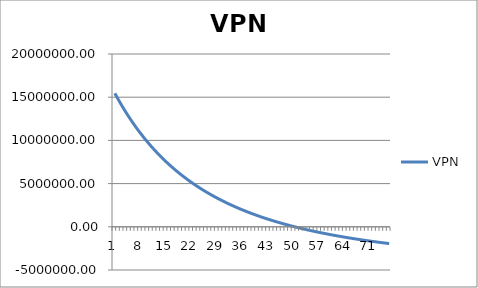
| Category | VPN |
|---|---|
| 0 | 15451750.503 |
| 1 | 14687321.208 |
| 2 | 13961316.212 |
| 3 | 13271384.889 |
| 4 | 12615343.767 |
| 5 | 11991163.071 |
| 6 | 11396954.472 |
| 7 | 10830959.926 |
| 8 | 10291541.487 |
| 9 | 9777172.008 |
| 10 | 9286426.642 |
| 11 | 8817975.075 |
| 12 | 8370574.407 |
| 13 | 7943062.636 |
| 14 | 7534352.68 |
| 15 | 7143426.894 |
| 16 | 6769332.028 |
| 17 | 6411174.603 |
| 18 | 6068116.648 |
| 19 | 5739371.781 |
| 20 | 5424201.596 |
| 21 | 5121912.337 |
| 22 | 4831851.82 |
| 23 | 4553406.603 |
| 24 | 4285999.363 |
| 25 | 4029086.474 |
| 26 | 3782155.767 |
| 27 | 3544724.455 |
| 28 | 3316337.214 |
| 29 | 3096564.397 |
| 30 | 2885000.386 |
| 31 | 2681262.058 |
| 32 | 2484987.361 |
| 33 | 2295833.989 |
| 34 | 2113478.155 |
| 35 | 1937613.446 |
| 36 | 1767949.758 |
| 37 | 1604212.299 |
| 38 | 1446140.674 |
| 39 | 1293488.012 |
| 40 | 1146020.172 |
| 41 | 1003514.985 |
| 42 | 865761.557 |
| 43 | 732559.609 |
| 44 | 603718.874 |
| 45 | 479058.512 |
| 46 | 358406.586 |
| 47 | 241599.549 |
| 48 | 128481.784 |
| 49 | 18905.156 |
| 50 | -87271.398 |
| 51 | -190182.256 |
| 52 | -289955.477 |
| 53 | -386713.138 |
| 54 | -480571.662 |
| 55 | -571642.112 |
| 56 | -660030.478 |
| 57 | -745837.943 |
| 58 | -829161.134 |
| 59 | -910092.357 |
| 60 | -988719.822 |
| 61 | -1065127.849 |
| 62 | -1139397.066 |
| 63 | -1211604.598 |
| 64 | -1281824.24 |
| 65 | -1350126.624 |
| 66 | -1416579.372 |
| 67 | -1481247.25 |
| 68 | -1544192.301 |
| 69 | -1605473.981 |
| 70 | -1665149.282 |
| 71 | -1723272.851 |
| 72 | -1779897.1 |
| 73 | -1835072.313 |
| 74 | -1888846.743 |
| 75 | -1941266.713 |